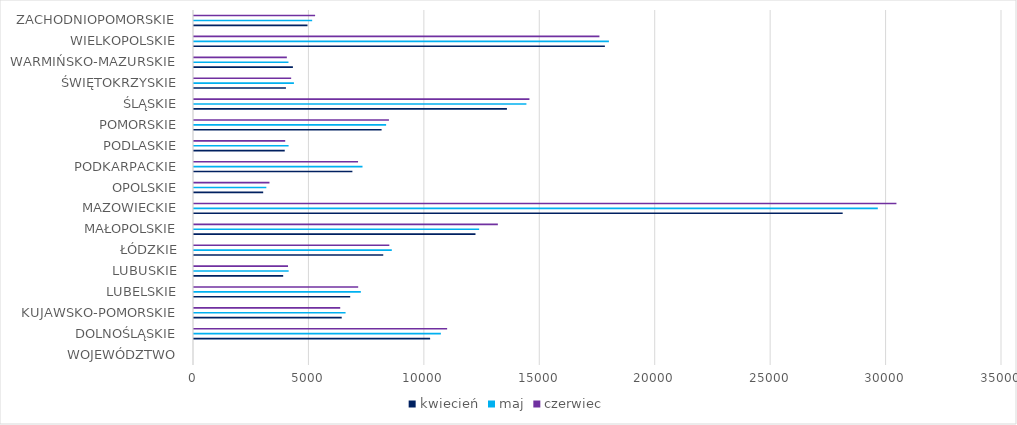
| Category | Series 0 | Series 1 | kwiecień | Series 3 | Series 4 | maj | Series 6 | Series 7 | czerwiec | Series 9 | Series 10 |
|---|---|---|---|---|---|---|---|---|---|---|---|
| WOJEWÓDZTWO |  |  | 0 |  |  | 0 |  |  | 0 |  |  |
| DOLNOŚLĄSKIE |  |  | 10228 |  |  | 10694 |  |  | 10965 |  |  |
| KUJAWSKO-POMORSKIE |  |  | 6399 |  |  | 6565 |  |  | 6334 |  |  |
| LUBELSKIE |  |  | 6766 |  |  | 7227 |  |  | 7112 |  |  |
| LUBUSKIE |  |  | 3863 |  |  | 4100 |  |  | 4073 |  |  |
| ŁÓDZKIE |  |  | 8198 |  |  | 8568 |  |  | 8461 |  |  |
| MAŁOPOLSKIE |  |  | 12193 |  |  | 12352 |  |  | 13162 |  |  |
| MAZOWIECKIE |  |  | 28099 |  |  | 29620 |  |  | 30427 |  |  |
| OPOLSKIE |  |  | 2997 |  |  | 3133 |  |  | 3269 |  |  |
| PODKARPACKIE |  |  | 6861 |  |  | 7299 |  |  | 7106 |  |  |
| PODLASKIE |  |  | 3931 |  |  | 4098 |  |  | 3951 |  |  |
| POMORSKIE |  |  | 8126 |  |  | 8322 |  |  | 8444 |  |  |
| ŚLĄSKIE |  |  | 13555 |  |  | 14399 |  |  | 14530 |  |  |
| ŚWIĘTOKRZYSKIE |  |  | 3982 |  |  | 4328 |  |  | 4209 |  |  |
| WARMIŃSKO-MAZURSKIE |  |  | 4284 |  |  | 4092 |  |  | 4022 |  |  |
| WIELKOPOLSKIE |  |  | 17798 |  |  | 17973 |  |  | 17562 |  |  |
| ZACHODNIOPOMORSKIE |  |  | 4916 |  |  | 5118 |  |  | 5246 |  |  |